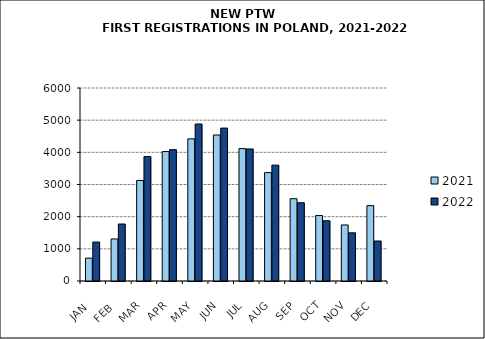
| Category | 2021 | 2022 |
|---|---|---|
|  JAN  | 711 | 1211 |
|  FEB  | 1307 | 1772 |
| MAR | 3125 | 3869 |
| APR | 4024 | 4082 |
| MAY | 4420 | 4881 |
| JUN | 4539 | 4754 |
| JUL | 4116 | 4105 |
| AUG | 3369 | 3602 |
| SEP | 2558 | 2434 |
| OCT | 2035 | 1873 |
| NOV | 1742 | 1498 |
| DEC | 2343 | 1243 |